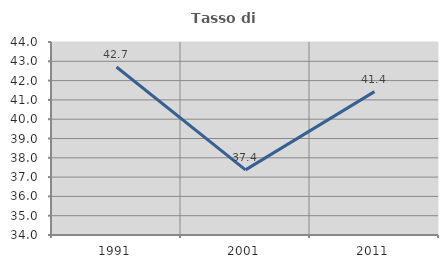
| Category | Tasso di occupazione   |
|---|---|
| 1991.0 | 42.704 |
| 2001.0 | 37.375 |
| 2011.0 | 41.429 |